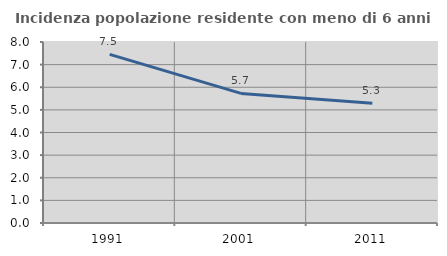
| Category | Incidenza popolazione residente con meno di 6 anni |
|---|---|
| 1991.0 | 7.454 |
| 2001.0 | 5.727 |
| 2011.0 | 5.295 |